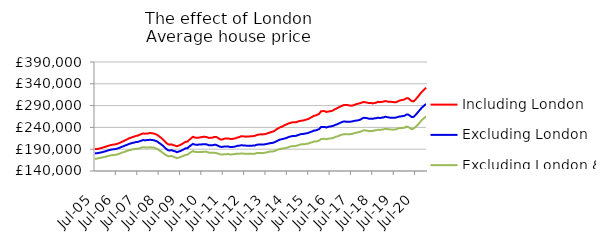
| Category | Including London | Excluding London | Excluding London & SE |
|---|---|---|---|
| 2005-07-01 | 190099.846 | 180338.943 | 168115.943 |
| 2005-08-01 | 190409.416 | 180707.116 | 168387.745 |
| 2005-09-01 | 191025.705 | 181294.079 | 169165.237 |
| 2005-10-01 | 192128.229 | 182260.003 | 170136.846 |
| 2005-11-01 | 193022.749 | 183020.557 | 170802.395 |
| 2005-12-01 | 194589.472 | 184321.051 | 171890.78 |
| 2006-01-01 | 195561.889 | 185223.855 | 172601.05 |
| 2006-02-01 | 197180.233 | 186694.526 | 173973.307 |
| 2006-03-01 | 198290.018 | 187883.534 | 175074.67 |
| 2006-04-01 | 199521.21 | 188954.872 | 175987.174 |
| 2006-05-01 | 200291.878 | 189620.06 | 176437.969 |
| 2006-06-01 | 200874.24 | 190048.53 | 176847.591 |
| 2006-07-01 | 201753.772 | 190830.896 | 177451.803 |
| 2006-08-01 | 202945.476 | 191932.237 | 178625.067 |
| 2006-09-01 | 204665.909 | 193486.107 | 180029.257 |
| 2006-10-01 | 206669.853 | 195431.198 | 181917.714 |
| 2006-11-01 | 208271.992 | 196704.296 | 182996.889 |
| 2006-12-01 | 210431.706 | 198484.218 | 184628.33 |
| 2007-01-01 | 212236.573 | 199867.99 | 185753.039 |
| 2007-02-01 | 214691.924 | 201953.448 | 187491.53 |
| 2007-03-01 | 215960.598 | 202950.014 | 188129.855 |
| 2007-04-01 | 217668.208 | 204390.327 | 189305.612 |
| 2007-05-01 | 218745.526 | 205176.529 | 190051.523 |
| 2007-06-01 | 220436.757 | 206350.676 | 190766.928 |
| 2007-07-01 | 221128.98 | 206601.586 | 190934.336 |
| 2007-08-01 | 222903.284 | 208023.687 | 191970.933 |
| 2007-09-01 | 224639.27 | 209648.69 | 193488.751 |
| 2007-10-01 | 225909.983 | 210886.574 | 194554.085 |
| 2007-11-01 | 225637.65 | 210701.658 | 194139.319 |
| 2007-12-01 | 225795.991 | 210808.016 | 194100.151 |
| 2008-01-01 | 226230.744 | 210997.948 | 193849.067 |
| 2008-02-01 | 227150.677 | 211685.752 | 194629.825 |
| 2008-03-01 | 226536.237 | 211131.036 | 194027.854 |
| 2008-04-01 | 226088.749 | 210687.499 | 193735.581 |
| 2008-05-01 | 224583.894 | 209243.33 | 192031.653 |
| 2008-06-01 | 222870.934 | 207605.676 | 190599.84 |
| 2008-07-01 | 219624.904 | 204552.197 | 187738.181 |
| 2008-08-01 | 216697.269 | 201783.679 | 185273.991 |
| 2008-09-01 | 213087.292 | 198550.708 | 182220.184 |
| 2008-10-01 | 209193.305 | 194954.131 | 179292.765 |
| 2008-11-01 | 204692.274 | 190946.059 | 176189.96 |
| 2008-12-01 | 201599.231 | 187849.92 | 174117.242 |
| 2009-01-01 | 200403.32 | 186878.072 | 173689.928 |
| 2009-02-01 | 201116.809 | 187902.199 | 174505.275 |
| 2009-03-01 | 199383.582 | 186328.236 | 172948.571 |
| 2009-04-01 | 198315.606 | 185259.882 | 171374.665 |
| 2009-05-01 | 196756.715 | 183093.397 | 169466.686 |
| 2009-06-01 | 198255.489 | 184493.743 | 170575.472 |
| 2009-07-01 | 199781.16 | 185725.435 | 171866.354 |
| 2009-08-01 | 202057.625 | 187894.019 | 173683.287 |
| 2009-09-01 | 204651.712 | 189897.228 | 175272.485 |
| 2009-10-01 | 206995.738 | 192147.604 | 177124.978 |
| 2009-11-01 | 207417.779 | 192401.732 | 177434.262 |
| 2009-12-01 | 211553.202 | 196348.095 | 180850.865 |
| 2010-01-01 | 214802.067 | 199095.743 | 183197.337 |
| 2010-02-01 | 218402.314 | 202123.005 | 185706.212 |
| 2010-03-01 | 216980.15 | 200671.83 | 184170.446 |
| 2010-04-01 | 216236.552 | 200161.69 | 183628.078 |
| 2010-05-01 | 216342.245 | 200449.238 | 183492.691 |
| 2010-06-01 | 217108.95 | 200783.748 | 183659.372 |
| 2010-07-01 | 217722.397 | 201016.807 | 183577.266 |
| 2010-08-01 | 218424.805 | 201510.881 | 184095.582 |
| 2010-09-01 | 218322.566 | 201613.716 | 184429.571 |
| 2010-10-01 | 217469.066 | 200750.626 | 183714.847 |
| 2010-11-01 | 215945.135 | 199049.754 | 182199.609 |
| 2010-12-01 | 216018.582 | 198791.843 | 181915.72 |
| 2011-01-01 | 216546.568 | 199114.513 | 181707.335 |
| 2011-02-01 | 218068.153 | 200152.075 | 182069.043 |
| 2011-03-01 | 218196.649 | 199966.213 | 181215.956 |
| 2011-04-01 | 216131.402 | 198173.837 | 180210.582 |
| 2011-05-01 | 213449.47 | 196231.995 | 178717.115 |
| 2011-06-01 | 211977.123 | 195154.451 | 177946.276 |
| 2011-07-01 | 212947.067 | 195568.747 | 178041.865 |
| 2011-08-01 | 214410.19 | 196445.281 | 178684.615 |
| 2011-09-01 | 214360.747 | 196165.982 | 178661.749 |
| 2011-10-01 | 214614.218 | 196213.259 | 178936.575 |
| 2011-11-01 | 213368.423 | 194966.866 | 177953.868 |
| 2011-12-01 | 213453.491 | 194865.197 | 178125.881 |
| 2012-01-01 | 214164.256 | 195514.42 | 178545.093 |
| 2012-02-01 | 214959.421 | 196404.975 | 179356.541 |
| 2012-03-01 | 216756.933 | 197817.955 | 179833.607 |
| 2012-04-01 | 217525.251 | 197898.314 | 179527.6 |
| 2012-05-01 | 219534.588 | 198949.536 | 180120.689 |
| 2012-06-01 | 219513.993 | 198774.052 | 180105.596 |
| 2012-07-01 | 219293.182 | 198462.317 | 179541.287 |
| 2012-08-01 | 218806.749 | 198165.774 | 179441.589 |
| 2012-09-01 | 219040.471 | 197834.003 | 179242.398 |
| 2012-10-01 | 219439.904 | 198189.625 | 179878.203 |
| 2012-11-01 | 219547.943 | 197705.403 | 179149.824 |
| 2012-12-01 | 220234.493 | 198496.975 | 179579.951 |
| 2013-01-01 | 220907.865 | 198670.322 | 179702.72 |
| 2013-02-01 | 222701.635 | 200446.331 | 181549.7 |
| 2013-03-01 | 223469.687 | 200554.563 | 181214.051 |
| 2013-04-01 | 224076.303 | 200944.861 | 181537.119 |
| 2013-05-01 | 223921.625 | 200574.706 | 180786.657 |
| 2013-06-01 | 224267.124 | 200953.441 | 181634.225 |
| 2013-07-01 | 225135.999 | 201680.442 | 182212.686 |
| 2013-08-01 | 226546.907 | 202586.569 | 183374.231 |
| 2013-09-01 | 227936.906 | 203391.678 | 184304.363 |
| 2013-10-01 | 229322.843 | 204234.069 | 184859.274 |
| 2013-11-01 | 230315.56 | 204602.914 | 184983.348 |
| 2013-12-01 | 232460.97 | 206225.51 | 185922.887 |
| 2014-01-01 | 235647.935 | 208367.783 | 187801.311 |
| 2014-02-01 | 237927.871 | 210397.831 | 189383.724 |
| 2014-03-01 | 240195.48 | 212153.651 | 190765.188 |
| 2014-04-01 | 241469.41 | 212884.813 | 191208.257 |
| 2014-05-01 | 243828.789 | 214011.28 | 191911.354 |
| 2014-06-01 | 245878.968 | 214988.938 | 192449.329 |
| 2014-07-01 | 247539.081 | 216525.132 | 193508.231 |
| 2014-08-01 | 249418.581 | 218299.792 | 195238.949 |
| 2014-09-01 | 250747.668 | 219267.162 | 196217.978 |
| 2014-10-01 | 251554.885 | 220056.663 | 197190.317 |
| 2014-11-01 | 251534.53 | 220011.241 | 196854.96 |
| 2014-12-01 | 251925.861 | 220856.382 | 197709.619 |
| 2015-01-01 | 253431.809 | 222218.445 | 198798.752 |
| 2015-02-01 | 254648.094 | 223740.73 | 200411.959 |
| 2015-03-01 | 255340.043 | 224687.291 | 201074.597 |
| 2015-04-01 | 255876.646 | 224953.264 | 201223.329 |
| 2015-05-01 | 257025.996 | 225743.668 | 201647.303 |
| 2015-06-01 | 258406.622 | 226541.496 | 202357.934 |
| 2015-07-01 | 259602.635 | 227594.255 | 203220.157 |
| 2015-08-01 | 262060.066 | 229279.729 | 204864.029 |
| 2015-09-01 | 264071.331 | 230781.509 | 205875.688 |
| 2015-10-01 | 266782.334 | 232880.229 | 207519.819 |
| 2015-11-01 | 267291.861 | 233078.556 | 207401.625 |
| 2015-12-01 | 269274.759 | 234653.062 | 208682.249 |
| 2016-01-01 | 271443.4 | 236250.053 | 209960.366 |
| 2016-02-01 | 277004.369 | 240964.363 | 213565.188 |
| 2016-03-01 | 277389.465 | 241069.016 | 213647.835 |
| 2016-04-01 | 277297.091 | 241113.692 | 213747.829 |
| 2016-05-01 | 275418.62 | 239697.966 | 212715.74 |
| 2016-06-01 | 276421.502 | 241310.921 | 214050.192 |
| 2016-07-01 | 276889.319 | 242056.992 | 214467.794 |
| 2016-08-01 | 277720.279 | 242891.392 | 215117.975 |
| 2016-09-01 | 279478.836 | 243807.73 | 215967.563 |
| 2016-10-01 | 282129.038 | 245841.601 | 218145.007 |
| 2016-11-01 | 283867.789 | 246937.83 | 219176.651 |
| 2016-12-01 | 285994.373 | 248943.025 | 220801.556 |
| 2017-01-01 | 288305.174 | 250939.187 | 222234.01 |
| 2017-02-01 | 290047.786 | 252664.53 | 223665.666 |
| 2017-03-01 | 291500.755 | 253648.484 | 224617.928 |
| 2017-04-01 | 291264.163 | 253147.959 | 224186.554 |
| 2017-05-01 | 291153.386 | 253193.423 | 224375.022 |
| 2017-06-01 | 290026.535 | 252897.924 | 224334.818 |
| 2017-07-01 | 289885.181 | 253387.675 | 224923.239 |
| 2017-08-01 | 290351.528 | 254209.469 | 225867.267 |
| 2017-09-01 | 292184.806 | 255170.845 | 227087.971 |
| 2017-10-01 | 293542.539 | 255913.818 | 228216.141 |
| 2017-11-01 | 294658.844 | 256267.421 | 228814.007 |
| 2017-12-01 | 295560.962 | 257834.073 | 230059.837 |
| 2018-01-01 | 297174.388 | 260013.605 | 231751.663 |
| 2018-02-01 | 298313.44 | 262036.077 | 233468.14 |
| 2018-03-01 | 297460.703 | 261701.24 | 233051.072 |
| 2018-04-01 | 296660.349 | 261063.081 | 232359.108 |
| 2018-05-01 | 295704.696 | 259681.755 | 231217.99 |
| 2018-06-01 | 296136.927 | 260172.462 | 231919.124 |
| 2018-07-01 | 295042.264 | 259596.91 | 231731.04 |
| 2018-08-01 | 295883.669 | 260772.254 | 232991.887 |
| 2018-09-01 | 296762.15 | 261122.803 | 233452.043 |
| 2018-10-01 | 298734.445 | 262365.668 | 234840.094 |
| 2018-11-01 | 297922.637 | 261492.678 | 234166.899 |
| 2018-12-01 | 298518.107 | 262206.952 | 235031.488 |
| 2019-01-01 | 299093.542 | 262906.932 | 235428.253 |
| 2019-02-01 | 300431.453 | 264388.896 | 236807.582 |
| 2019-03-01 | 299548.518 | 263726.655 | 236210.189 |
| 2019-04-01 | 298786.331 | 262815.384 | 235752.734 |
| 2019-05-01 | 298702.174 | 262138.985 | 235193.007 |
| 2019-06-01 | 298476.807 | 262004.363 | 234848.328 |
| 2019-07-01 | 297781.067 | 262038.546 | 234950.375 |
| 2019-08-01 | 297651.034 | 262455.802 | 235564.872 |
| 2019-09-01 | 299377.863 | 263670.032 | 237151.933 |
| 2019-10-01 | 301391.542 | 264978.293 | 238391.19 |
| 2019-11-01 | 302438.05 | 265359.18 | 238445.405 |
| 2019-12-01 | 303216.779 | 265948.726 | 238826.888 |
| 2020-01-01 | 304512.311 | 266899.82 | 239474.363 |
| 2020-02-01 | 306896.792 | 269614.827 | 241953.424 |
| 2020-03-01 | 306681.767 | 269329.186 | 240835.851 |
| 2020-04-01 | 303364.692 | 266578.226 | 238079.631 |
| 2020-05-01 | 300153.872 | 263601.605 | 235790.786 |
| 2020-06-01 | 300056.989 | 264195.766 | 237357.973 |
| 2020-07-01 | 303568.308 | 268092.332 | 240883.837 |
| 2020-08-01 | 308569.801 | 272872.362 | 244555.55 |
| 2020-09-01 | 313220.26 | 277683.12 | 248850.584 |
| 2020-10-01 | 318769.544 | 282586.112 | 253922.481 |
| 2020-11-01 | 322829.789 | 286743.783 | 258363.37 |
| 2020-12-01 | 327118.328 | 290306.442 | 261757.132 |
| 2021-01-01 | 330957.71 | 293883.726 | 265165.914 |